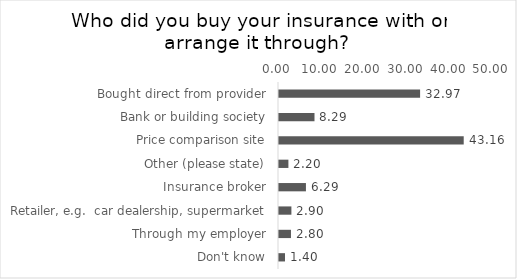
| Category | % of Respondents |
|---|---|
| Bought direct from provider | 32.967 |
| Bank or building society | 8.292 |
| Price comparison site | 43.157 |
| Other (please state) | 2.198 |
| Insurance broker | 6.294 |
| Retailer, e.g.  car dealership, supermarket | 2.897 |
| Through my employer | 2.797 |
| Don't know | 1.399 |